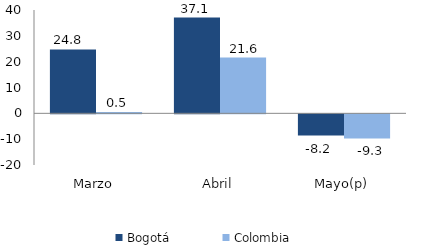
| Category | Bogotá | Colombia |
|---|---|---|
| Marzo | 24.752 | 0.536 |
| Abril | 37.058 | 21.568 |
| Mayo(p) | -8.2 | -9.347 |